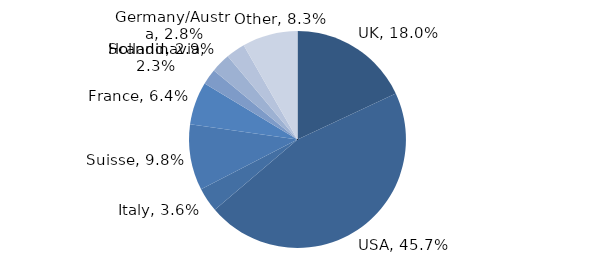
| Category | Investment Style |
|---|---|
| UK | 0.18 |
| USA | 0.457 |
| Italy | 0.036 |
| Suisse | 0.098 |
| France | 0.064 |
| Scandinavia | 0.023 |
| Holland | 0.029 |
| Germany/Austria | 0.028 |
| Other | 0.083 |